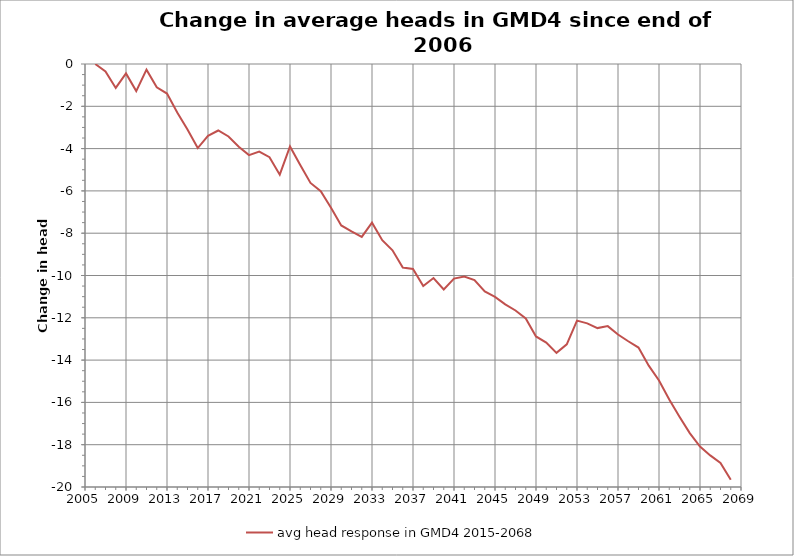
| Category | avg head response in GMD4 2015-2068 |
|---|---|
| 39082.0 | 0 |
| 39447.0 | -0.349 |
| 39813.0 | -1.131 |
| 40178.0 | -0.448 |
| 40543.0 | -1.282 |
| 40908.0 | -0.267 |
| 41274.0 | -1.099 |
| 41639.0 | -1.398 |
| 42004.0 | -2.294 |
| 42369.0 | -3.094 |
| 42735.0 | -3.973 |
| 43100.0 | -3.393 |
| 43465.0 | -3.144 |
| 43830.0 | -3.427 |
| 44196.0 | -3.913 |
| 44561.0 | -4.309 |
| 44926.0 | -4.145 |
| 45291.0 | -4.408 |
| 45657.0 | -5.231 |
| 46022.0 | -3.897 |
| 46387.0 | -4.776 |
| 46752.0 | -5.623 |
| 47118.0 | -6.014 |
| 47483.0 | -6.798 |
| 47848.0 | -7.631 |
| 48213.0 | -7.918 |
| 48579.0 | -8.174 |
| 48944.0 | -7.5 |
| 49309.0 | -8.331 |
| 49674.0 | -8.811 |
| 50040.0 | -9.626 |
| 50405.0 | -9.688 |
| 50770.0 | -10.5 |
| 51135.0 | -10.119 |
| 51501.0 | -10.66 |
| 51866.0 | -10.148 |
| 52231.0 | -10.047 |
| 52596.0 | -10.214 |
| 52962.0 | -10.751 |
| 53327.0 | -11.008 |
| 53692.0 | -11.368 |
| 54057.0 | -11.654 |
| 54423.0 | -12.034 |
| 54788.0 | -12.883 |
| 55153.0 | -13.175 |
| 55518.0 | -13.657 |
| 55884.0 | -13.257 |
| 56249.0 | -12.132 |
| 56614.0 | -12.262 |
| 56979.0 | -12.487 |
| 57345.0 | -12.393 |
| 57710.0 | -12.79 |
| 58075.0 | -13.11 |
| 58440.0 | -13.406 |
| 58806.0 | -14.263 |
| 59171.0 | -14.964 |
| 59536.0 | -15.867 |
| 59901.0 | -16.677 |
| 60267.0 | -17.452 |
| 60632.0 | -18.087 |
| 60997.0 | -18.506 |
| 61362.0 | -18.864 |
| 61728.0 | -19.656 |